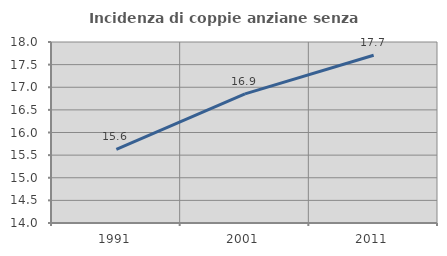
| Category | Incidenza di coppie anziane senza figli  |
|---|---|
| 1991.0 | 15.625 |
| 2001.0 | 16.854 |
| 2011.0 | 17.708 |